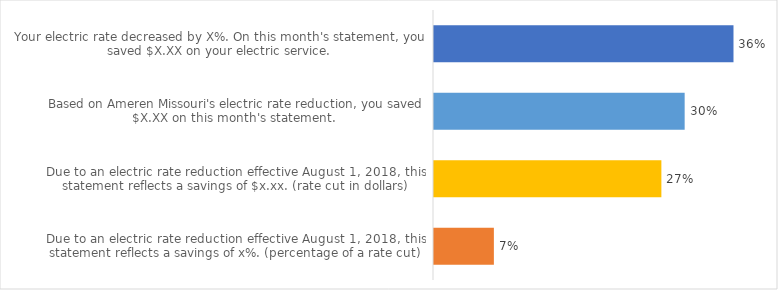
| Category | Series 0 |
|---|---|
| Due to an electric rate reduction effective August 1, 2018, this statement reflects a savings of x%. (percentage of a rate cut) | 0.072 |
| Due to an electric rate reduction effective August 1, 2018, this statement reflects a savings of $x.xx. (rate cut in dollars) | 0.272 |
| Based on Ameren Missouri's electric rate reduction, you saved $X.XX on this month's statement.  | 0.299 |
| Your electric rate decreased by X%. On this month's statement, you saved $X.XX on your electric service. | 0.358 |